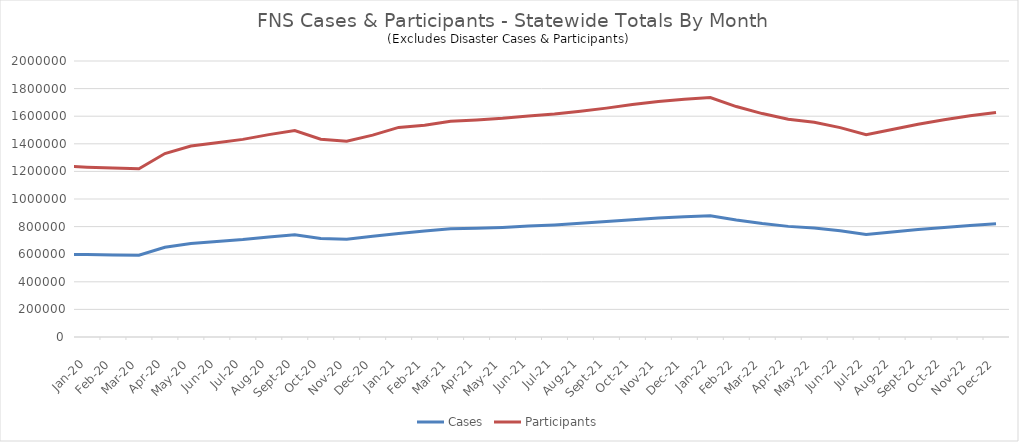
| Category | Cases | Participants |
|---|---|---|
| 2022-12-01 | 819988 | 1627510 |
| 2022-11-22 | 807954 | 1603733 |
| 2022-10-22 | 793295 | 1573607 |
| 2022-09-22 | 778624 | 1542337 |
| 2022-08-22 | 760969 | 1503060 |
| 2022-07-22 | 743373 | 1465807 |
| 2022-06-22 | 769742 | 1517109 |
| 2022-05-22 | 790586 | 1556216 |
| 2022-04-22 | 801606 | 1578568 |
| 2022-03-22 | 821802 | 1618945 |
| 2022-02-22 | 847649 | 1669984 |
| 2022-01-22 | 878760 | 1735304 |
| 2021-12-21 | 871424 | 1723282 |
| 2021-11-21 | 861852 | 1706619 |
| 2021-10-21 | 850179 | 1685344 |
| 2021-09-21 | 836128 | 1658505 |
| 2021-08-21 | 823741 | 1635673 |
| 2021-07-21 | 811849 | 1615178 |
| 2021-06-21 | 803745 | 1600910 |
| 2021-05-21 | 793861 | 1584758 |
| 2021-04-21 | 788110 | 1573171 |
| 2021-03-21 | 783666 | 1563429 |
| 2021-02-21 | 767846 | 1535201 |
| 2021-01-21 | 749469 | 1518981 |
| 2020-12-20 | 730466 | 1462651 |
| 2020-11-20 | 709019 | 1419309 |
| 2020-10-20 | 713731 | 1433232 |
| 2020-09-20 | 741217 | 1496110 |
| 2020-08-20 | 725454 | 1466449 |
| 2020-07-20 | 706448 | 1431972 |
| 2020-06-20 | 691992 | 1407400 |
| 2020-05-20 | 677697 | 1383470 |
| 2020-04-20 | 649710 | 1329266 |
| 2020-03-20 | 592523 | 1218886 |
| 2020-02-20 | 594553 | 1224307 |
| 2020-01-20 | 597264 | 1230448 |
| 2019-12-19 | 600081 | 1239256 |
| 2019-11-19 | 605560 | 1252249 |
| 2019-10-19 | 610326 | 1263911 |
| 2019-09-19 | 613717 | 1273942 |
| 2019-08-19 | 612505 | 1270849 |
| 2019-07-19 | 605942 | 1255071 |
| 2019-06-19 | 605568 | 1252211 |
| 2019-05-19 | 605659 | 1251409 |
| 2019-04-19 | 611770 | 1263000 |
| 2019-03-19 | 627016 | 1296157 |
| 2019-02-01 | 657594 | 1362990 |
| 2019-01-01 | 642203 | 1335093 |
| 2018-12-01 | 646132 | 1330475 |
| 2018-11-01 | 650008 | 1343522 |